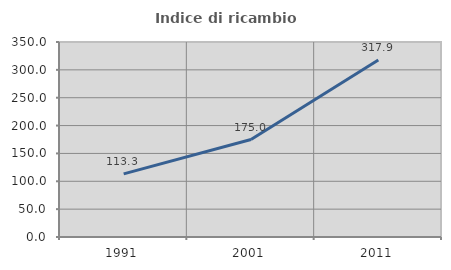
| Category | Indice di ricambio occupazionale  |
|---|---|
| 1991.0 | 113.333 |
| 2001.0 | 175 |
| 2011.0 | 317.857 |